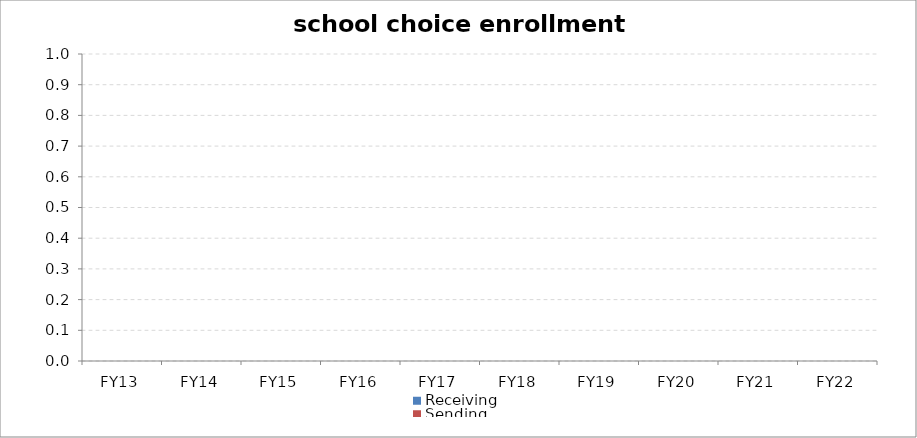
| Category | Receiving | Sending |
|---|---|---|
| FY13 | 0 | 0 |
| FY14 | 0 | 0 |
| FY15 | 0 | 0 |
| FY16 | 0 | 0 |
| FY17 | 0 | 0 |
| FY18 | 0 | 0 |
| FY19 | 0 | 0 |
| FY20 | 0 | 0 |
| FY21 | 0 | 0 |
| FY22 | 0 | 0 |